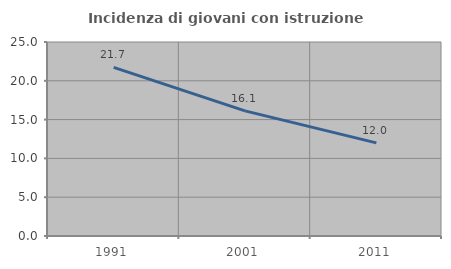
| Category | Incidenza di giovani con istruzione universitaria |
|---|---|
| 1991.0 | 21.739 |
| 2001.0 | 16.129 |
| 2011.0 | 12 |